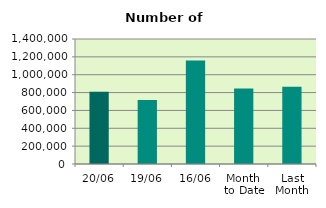
| Category | Series 0 |
|---|---|
| 20/06 | 810200 |
| 19/06 | 717440 |
| 16/06 | 1159964 |
| Month 
to Date | 845149.714 |
| Last
Month | 864947.091 |